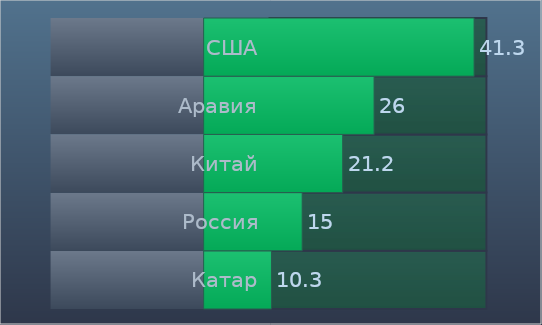
| Category | Подписи | Фон |
|---|---|---|
| Катар | -1 | 1 |
| Россия | -1 | 1 |
| Китай | -1 | 1 |
| Аравия | -1 | 1 |
| США | -1 | 1 |